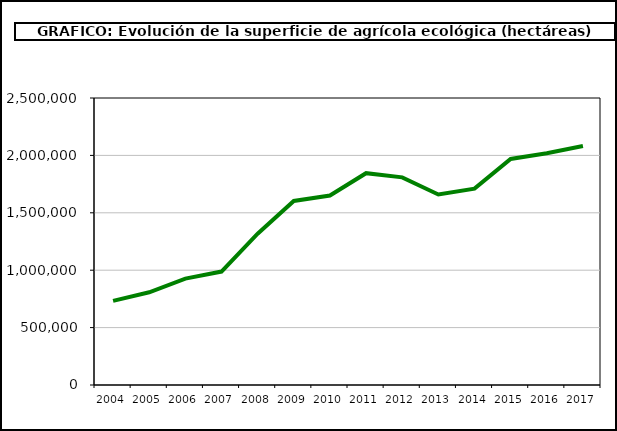
| Category | Superficie (ha) |
|---|---|
| 2004.0 | 733182 |
| 2005.0 | 807569 |
| 2006.0 | 926390 |
| 2007.0 | 988323 |
| 2008.0 | 1317752 |
| 2009.0 | 1602868 |
| 2010.0 | 1650866 |
| 2011.0 | 1845039 |
| 2012.0 | 1808492 |
| 2013.0 | 1659916 |
| 2014.0 | 1710493 |
| 2015.0 | 1968570 |
| 2016.0 | 2018802 |
| 2017.0 | 2082173 |